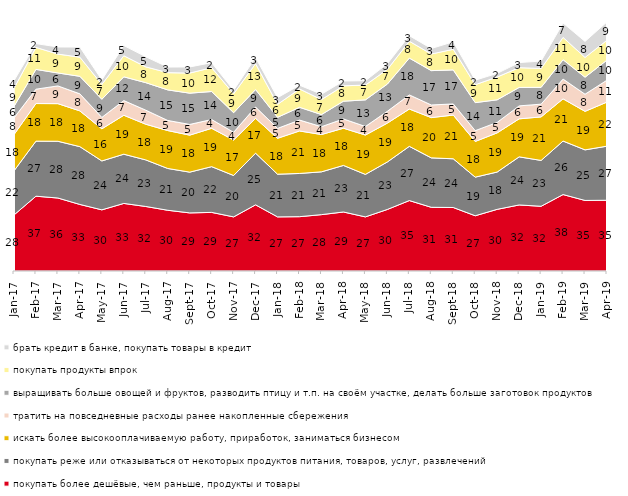
| Category | покупать более дешёвые, чем раньше, продукты и товары | покупать реже или отказываться от некоторых продуктов питания, товаров, услуг, развлечений | искать более высокооплачиваемую работу, приработок, заниматься бизнесом | тратить на повседневные расходы ранее накопленные сбережения | выращивать больше овощей и фруктов, разводить птицу и т.п. на своём участке, делать больше заготовок продуктов  | покупать продукты впрок | брать кредит в банке, покупать товары в кредит |
|---|---|---|---|---|---|---|---|
| 2017-01-01 | 27.5 | 21.65 | 17.8 | 8.15 | 5.7 | 8.85 | 3.75 |
| 2017-02-01 | 36.7 | 27 | 18.45 | 7.05 | 9.7 | 10.8 | 1.85 |
| 2017-03-01 | 35.8 | 27.85 | 18.45 | 8.7 | 6.35 | 9.25 | 3.5 |
| 2017-04-01 | 32.65 | 28.35 | 17.55 | 8.35 | 8.6 | 9.4 | 4.95 |
| 2017-05-01 | 30 | 24 | 15.75 | 5.6 | 8.9 | 7.3 | 2.2 |
| 2017-06-01 | 33.15 | 24.15 | 19.1 | 7.2 | 11.65 | 10.35 | 5 |
| 2017-07-01 | 31.65 | 22.85 | 17.5 | 6.9 | 13.5 | 7.75 | 4.95 |
| 2017-08-01 | 29.8 | 20.5 | 18.6 | 4.95 | 15 | 8.45 | 2.75 |
| 2017-09-01 | 28.5 | 20 | 18.15 | 5.25 | 15.35 | 9.85 | 3 |
| 2017-10-01 | 28.75 | 22.45 | 18.8 | 4.3 | 13.75 | 11.7 | 2.45 |
| 2017-11-01 | 26.55 | 20.3 | 17.4 | 3.8 | 9.6 | 9.3 | 1.7 |
| 2017-12-01 | 32.45 | 25.35 | 17.1 | 5.55 | 8.55 | 12.7 | 3.05 |
| 2018-01-01 | 26.55 | 20.95 | 17.6 | 4.85 | 5.45 | 6.35 | 3.3 |
| 2018-02-01 | 26.65 | 21.2 | 20.85 | 5.35 | 6.25 | 9 | 1.85 |
| 2018-03-01 | 27.65 | 21 | 18.3 | 3.85 | 5.95 | 7.35 | 2.65 |
| 2018-04-01 | 28.95 | 22.85 | 18.25 | 4.55 | 8.7 | 7.55 | 2.35 |
| 2018-05-01 | 26.55 | 20.85 | 19.3 | 4.2 | 13.05 | 7.25 | 2.15 |
| 2018-06-01 | 30.2 | 23.3 | 19.05 | 5.8 | 13.35 | 7.2 | 2.8 |
| 2018-07-01 | 34.55 | 26.6 | 18.3 | 6.95 | 18.05 | 8.25 | 2.75 |
| 2018-08-01 | 31.25 | 24.25 | 19.75 | 6.2 | 16.85 | 8.15 | 2.7 |
| 2018-09-01 | 31.15 | 23.9 | 21.45 | 5.45 | 16.7 | 10.1 | 3.7 |
| 2018-10-01 | 27.1 | 18.95 | 17.5 | 5.3 | 13.75 | 8.8 | 2.2 |
| 2018-11-01 | 30.24 | 18.313 | 19.212 | 5.14 | 11.078 | 11.178 | 1.796 |
| 2018-12-01 | 32.4 | 23.6 | 18.65 | 6.35 | 9.05 | 9.7 | 2.5 |
| 2019-01-01 | 31.75 | 22.5 | 21.35 | 6.25 | 8.25 | 9.25 | 3.65 |
| 2019-02-01 | 37.5 | 26.25 | 20.7 | 9.7 | 9.5 | 10.95 | 7.05 |
| 2019-03-01 | 34.61 | 24.814 | 18.896 | 8.404 | 8.354 | 9.697 | 7.857 |
| 2019-04-01 | 34.703 | 26.535 | 21.634 | 10.743 | 9.851 | 9.752 | 9.01 |